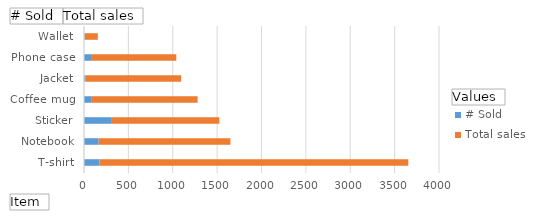
| Category | # Sold | Total sales |
|---|---|---|
| T-shirt | 174 | 3480 |
| Notebook | 165 | 1485 |
| Sticker | 305 | 1220 |
| Coffee mug | 80 | 1200 |
| Jacket | 15 | 1080 |
| Phone case | 80 | 960 |
| Wallet | 6 | 150 |